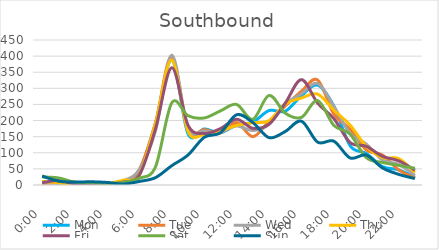
| Category | Mon | Tue | Wed | Thu | Fri | Sat | Sun |
|---|---|---|---|---|---|---|---|
| 0.0 | 10 | 4 | 6 | 11 | 7 | 25 | 28 |
| 0.041667 | 5 | 7 | 6 | 7 | 14 | 22 | 12 |
| 0.083333 | 3 | 5 | 5 | 1 | 4 | 9 | 9 |
| 0.125 | 3 | 5 | 1 | 6 | 4 | 7 | 10 |
| 0.166667 | 1 | 1 | 2 | 5 | 2 | 5 | 8 |
| 0.208333 | 10 | 9 | 13 | 15 | 9 | 8 | 3 |
| 0.25 | 44 | 48 | 48 | 32 | 31 | 21 | 11 |
| 0.291667 | 192 | 194 | 169 | 192 | 175 | 57 | 23 |
| 0.333333 | 389 | 400 | 403 | 388 | 364 | 255 | 60 |
| 0.375 | 159 | 170 | 176 | 167 | 186 | 215 | 93 |
| 0.416667 | 174 | 172 | 168 | 157 | 160 | 208 | 148 |
| 0.458333 | 162 | 162 | 164 | 168 | 175 | 230 | 162 |
| 0.5 | 187 | 194 | 183 | 185 | 204 | 250 | 218 |
| 0.541667 | 195 | 150 | 169 | 193 | 176 | 204 | 194 |
| 0.5833333333333334 | 231 | 198 | 188 | 200 | 189 | 278 | 147 |
| 0.625 | 229 | 245 | 251 | 251 | 254 | 223 | 166 |
| 0.666667 | 277 | 291 | 283 | 270 | 327 | 210 | 198 |
| 0.708333 | 310 | 326 | 315 | 282 | 254 | 262 | 133 |
| 0.75 | 245 | 220 | 244 | 232 | 206 | 185 | 136 |
| 0.791667 | 122 | 173 | 160 | 186 | 132 | 158 | 84 |
| 0.833333 | 98 | 109 | 127 | 120 | 120 | 85 | 93 |
| 0.875 | 57 | 93 | 78 | 85 | 89 | 70 | 53 |
| 0.916667 | 47 | 47 | 64 | 82 | 75 | 61 | 33 |
| 0.958333 | 24 | 22 | 30 | 39 | 46 | 52 | 20 |